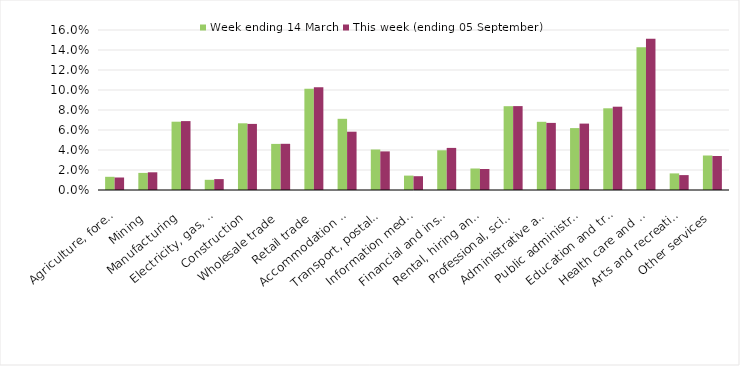
| Category | Week ending 14 March | This week (ending 05 September) |
|---|---|---|
| Agriculture, forestry and fishing | 0.013 | 0.012 |
| Mining | 0.017 | 0.018 |
| Manufacturing | 0.068 | 0.069 |
| Electricity, gas, water and waste services | 0.01 | 0.011 |
| Construction | 0.067 | 0.066 |
| Wholesale trade | 0.046 | 0.046 |
| Retail trade | 0.101 | 0.103 |
| Accommodation and food services | 0.071 | 0.058 |
| Transport, postal and warehousing | 0.04 | 0.039 |
| Information media and telecommunications | 0.014 | 0.014 |
| Financial and insurance services | 0.04 | 0.042 |
| Rental, hiring and real estate services | 0.022 | 0.021 |
| Professional, scientific and technical services | 0.084 | 0.084 |
| Administrative and support services | 0.068 | 0.067 |
| Public administration and safety | 0.062 | 0.066 |
| Education and training | 0.082 | 0.083 |
| Health care and social assistance | 0.143 | 0.151 |
| Arts and recreation services | 0.017 | 0.015 |
| Other services | 0.034 | 0.034 |